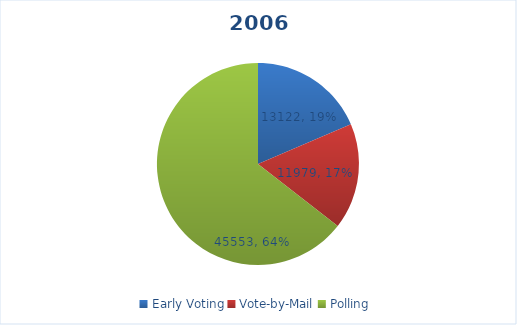
| Category | Series 0 |
|---|---|
| Early Voting | 13122 |
| Vote-by-Mail | 11979 |
| Polling | 45553 |